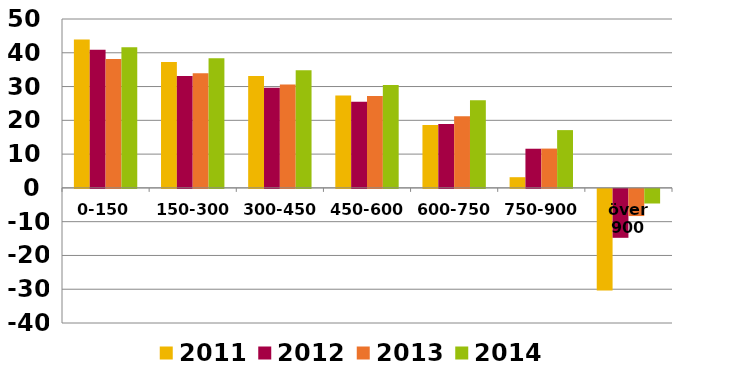
| Category | 2011 | 2012 | 2013 | 2014 |
|---|---|---|---|---|
| 0-150 | 43.937 | 40.894 | 38.138 | 41.654 |
| 150-300 | 37.253 | 33.14 | 33.946 | 38.392 |
| 300-450 | 33.107 | 29.622 | 30.623 | 34.826 |
| 450-600 | 27.33 | 25.533 | 27.217 | 30.469 |
| 600-750 | 18.637 | 18.886 | 21.18 | 25.917 |
| 750-900 | 3.161 | 11.592 | 11.637 | 17.105 |
| över 900 | -30.092 | -14.483 | -8.043 | -4.325 |